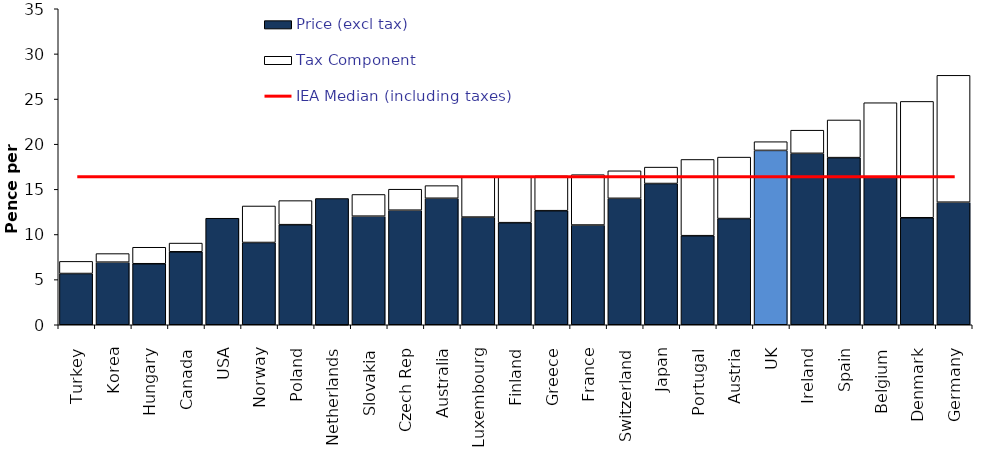
| Category | Price (excl tax) | Tax Component |
|---|---|---|
|  Turkey  | 5.675 | 1.346 |
|  Korea  | 6.934 | 0.95 |
|  Hungary  | 6.76 | 1.825 |
|  Canada  | 8.081 | 0.967 |
|  USA  | 11.799 | 0 |
|  Norway  | 9.111 | 4.043 |
|  Poland  | 11.086 | 2.665 |
|  Netherlands  | 13.982 | -0.142 |
|  Slovakia  | 12.026 | 2.405 |
|  Czech Rep  | 12.69 | 2.324 |
|  Australia  | 14.01 | 1.401 |
|  Luxembourg  | 11.925 | 4.419 |
|  Finland  | 11.307 | 5.116 |
|  Greece  | 12.634 | 3.852 |
|  France  | 11.046 | 5.577 |
|  Switzerland  | 14.004 | 3.048 |
|  Japan  | 15.643 | 1.818 |
|  Portugal  | 9.866 | 8.443 |
|  Austria  | 11.762 | 6.806 |
|  UK  | 19.311 | 0.966 |
|  Ireland  | 18.988 | 2.563 |
|  Spain  | 18.511 | 4.172 |
|  Belgium  | 16.341 | 8.252 |
|  Denmark  | 11.852 | 12.886 |
|  Germany  | 13.576 | 14.053 |